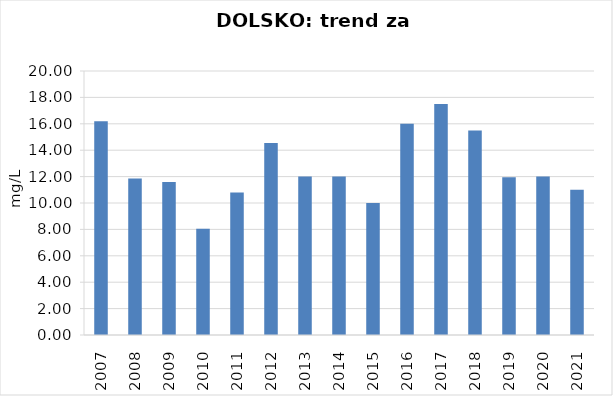
| Category | Vsota |
|---|---|
| 2007 | 16.2 |
| 2008 | 11.85 |
| 2009 | 11.6 |
| 2010 | 8.05 |
| 2011 | 10.8 |
| 2012 | 14.55 |
| 2013 | 12 |
| 2014 | 12 |
| 2015 | 10 |
| 2016 | 16 |
| 2017 | 17.5 |
| 2018 | 15.5 |
| 2019 | 11.95 |
| 2020 | 12 |
| 2021 | 11 |